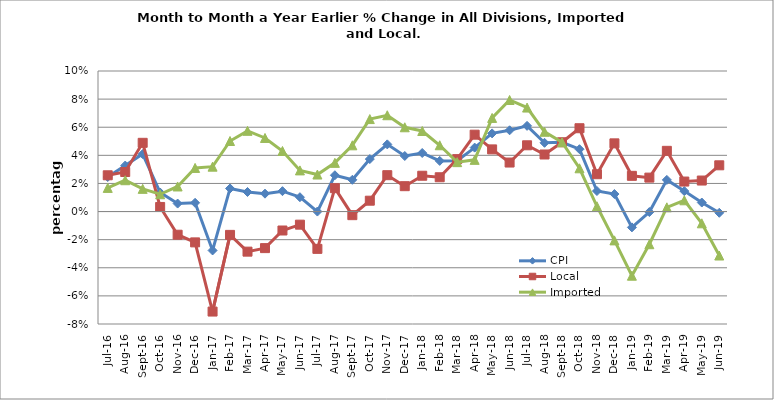
| Category | CPI | Local | Imported |
|---|---|---|---|
| 2016-07-01 | 0.025 | 0.026 | 0.017 |
| 2016-08-01 | 0.033 | 0.028 | 0.022 |
| 2016-09-01 | 0.041 | 0.049 | 0.016 |
| 2016-10-01 | 0.014 | 0.003 | 0.012 |
| 2016-11-01 | 0.006 | -0.016 | 0.018 |
| 2016-12-01 | 0.006 | -0.022 | 0.031 |
| 2017-01-01 | -0.028 | -0.071 | 0.032 |
| 2017-02-01 | 0.016 | -0.017 | 0.05 |
| 2017-03-01 | 0.014 | -0.029 | 0.057 |
| 2017-04-01 | 0.013 | -0.026 | 0.052 |
| 2017-05-01 | 0.015 | -0.013 | 0.043 |
| 2017-06-01 | 0.01 | -0.009 | 0.029 |
| 2017-07-01 | 0 | -0.027 | 0.026 |
| 2017-08-01 | 0.026 | 0.017 | 0.035 |
| 2017-09-01 | 0.023 | -0.003 | 0.047 |
| 2017-10-01 | 0.037 | 0.008 | 0.066 |
| 2017-11-01 | 0.048 | 0.026 | 0.069 |
| 2017-12-01 | 0.04 | 0.018 | 0.06 |
| 2018-01-01 | 0.042 | 0.025 | 0.057 |
| 2018-02-01 | 0.036 | 0.024 | 0.047 |
| 2018-03-01 | 0.036 | 0.037 | 0.035 |
| 2018-04-01 | 0.045 | 0.055 | 0.037 |
| 2018-05-01 | 0.056 | 0.044 | 0.067 |
| 2018-06-01 | 0.058 | 0.035 | 0.079 |
| 2018-07-01 | 0.061 | 0.047 | 0.074 |
| 2018-08-01 | 0.049 | 0.041 | 0.057 |
| 2018-09-01 | 0.049 | 0.049 | 0.049 |
| 2018-10-01 | 0.044 | 0.059 | 0.031 |
| 2018-11-01 | 0.015 | 0.027 | 0.004 |
| 2018-12-01 | 0.012 | 0.049 | -0.021 |
| 2019-01-01 | -0.011 | 0.025 | -0.046 |
| 2019-02-01 | 0 | 0.024 | -0.023 |
| 2019-03-01 | 0.023 | 0.043 | 0.003 |
| 2019-04-01 | 0.015 | 0.021 | 0.008 |
| 2019-05-01 | 0.006 | 0.022 | -0.008 |
| 2019-06-01 | -0.001 | 0.033 | -0.031 |